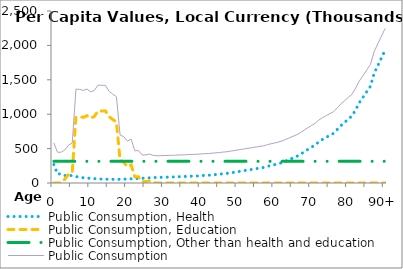
| Category | Public Consumption, Health | Public Consumption, Education | Public Consumption, Other than health and education | Public Consumption |
|---|---|---|---|---|
| 0 | 269180.341 | 0 | 315238.829 | 584419.17 |
|  | 130651.226 | 0 | 315238.829 | 445890.055 |
| 2 | 132973.435 | 0 | 315238.829 | 448212.264 |
| 3 | 108960.648 | 56925.528 | 315238.829 | 481125.005 |
| 4 | 108177.407 | 127485.189 | 315238.829 | 550901.425 |
| 5 | 108504.248 | 155849.815 | 315238.829 | 579592.893 |
| 6 | 94921.529 | 953799.516 | 315238.829 | 1363959.874 |
| 7 | 81411.27 | 964781.747 | 315238.829 | 1361431.846 |
| 8 | 76787.53 | 953878.912 | 315238.829 | 1345905.271 |
| 9 | 72190.279 | 978075.618 | 315238.829 | 1365504.725 |
| 10 | 67584.155 | 942850.805 | 315238.829 | 1325673.788 |
| 11 | 62978.394 | 966740.408 | 315238.829 | 1344957.632 |
| 12 | 58357.602 | 1048937.111 | 315238.829 | 1422533.542 |
| 13 | 57062.298 | 1047144.906 | 315238.829 | 1419446.032 |
| 14 | 55773.501 | 1048311.863 | 315238.829 | 1419324.193 |
| 15 | 54492.107 | 963937.778 | 315238.829 | 1333668.714 |
| 16 | 53199.974 | 923105.846 | 315238.829 | 1291544.649 |
| 17 | 51908.199 | 887334.637 | 315238.829 | 1254481.665 |
| 18 | 54012.556 | 327682.424 | 315238.829 | 696933.809 |
| 19 | 56101.066 | 302029.8 | 315238.829 | 673369.695 |
| 20 | 58212.193 | 235126.773 | 315238.829 | 608577.795 |
| 21 | 60311.878 | 261435.768 | 315238.829 | 636986.475 |
| 22 | 62374.358 | 90069.623 | 315238.829 | 467682.81 |
| 23 | 65693.699 | 89996.075 | 315238.829 | 470928.603 |
| 24 | 68980.292 | 21584.086 | 315238.829 | 405803.207 |
| 25 | 72290.96 | 21076.734 | 315238.829 | 408606.523 |
| 26 | 75583.635 | 29836.261 | 315238.829 | 420658.725 |
| 27 | 78910.839 | 7118.146 | 315238.829 | 401267.813 |
| 28 | 80547.707 | 0 | 315238.829 | 395786.536 |
| 29 | 82167.592 | 0 | 315238.829 | 397406.42 |
| 30 | 83822.464 | 0 | 315238.829 | 399061.293 |
| 31 | 85468.683 | 0 | 315238.829 | 400707.512 |
| 32 | 87049.79 | 0 | 315238.829 | 402288.619 |
| 33 | 89272.118 | 0 | 315238.829 | 404510.947 |
| 34 | 91496.674 | 0 | 315238.829 | 406735.502 |
| 35 | 93707.385 | 0 | 315238.829 | 408946.214 |
| 36 | 96036.455 | 0 | 315238.829 | 411275.284 |
| 37 | 98160.304 | 0 | 315238.829 | 413399.133 |
| 38 | 100277.812 | 0 | 315238.829 | 415516.641 |
| 39 | 102330.023 | 0 | 315238.829 | 417568.852 |
| 40 | 108229.289 | 0 | 315238.829 | 423468.118 |
| 41 | 110300.783 | 0 | 315238.829 | 425539.612 |
| 42 | 112412.881 | 0 | 315238.829 | 427651.709 |
| 43 | 117849.903 | 0 | 315238.829 | 433088.732 |
| 44 | 123143.302 | 0 | 315238.829 | 438382.13 |
| 45 | 128519.533 | 0 | 315238.829 | 443758.362 |
| 46 | 133805.157 | 0 | 315238.829 | 449043.986 |
| 47 | 139133.511 | 0 | 315238.829 | 454372.34 |
| 48 | 147737.911 | 0 | 315238.829 | 462976.74 |
| 49 | 156310.776 | 0 | 315238.829 | 471549.604 |
| 50 | 164940.639 | 0 | 315238.829 | 480179.468 |
| 51 | 173553.882 | 0 | 315238.829 | 488792.711 |
| 52 | 182377.233 | 0 | 315238.829 | 497616.062 |
| 53 | 191059.604 | 0 | 315238.829 | 506298.433 |
| 54 | 199643.541 | 0 | 315238.829 | 514882.37 |
| 55 | 208529.389 | 0 | 315238.829 | 523768.218 |
| 56 | 218008.06 | 0 | 315238.829 | 533246.888 |
| 57 | 225400.034 | 0 | 315238.829 | 540638.863 |
| 58 | 241236.092 | 0 | 315238.829 | 556474.921 |
| 59 | 254366.103 | 0 | 315238.829 | 569604.932 |
| 60 | 266776.604 | 0 | 315238.829 | 582015.433 |
| 61 | 280550.584 | 0 | 315238.829 | 595789.413 |
| 62 | 296459.444 | 0 | 315238.829 | 611698.273 |
| 63 | 318436.792 | 0 | 315238.829 | 633675.62 |
| 64 | 341931.554 | 0 | 315238.829 | 657170.383 |
| 65 | 364321.92 | 0 | 315238.829 | 679560.749 |
| 66 | 387008.498 | 0 | 315238.829 | 702247.327 |
| 67 | 416881.616 | 0 | 315238.829 | 732120.445 |
| 68 | 453275.775 | 0 | 315238.829 | 768514.603 |
| 69 | 487164.582 | 0 | 315238.829 | 802403.41 |
| 70 | 520592.401 | 0 | 315238.829 | 835831.229 |
| 71 | 553957.641 | 0 | 315238.829 | 869196.469 |
| 72 | 599997.834 | 0 | 315238.829 | 915236.663 |
| 73 | 634700.168 | 0 | 315238.829 | 949938.996 |
| 74 | 663865.893 | 0 | 315238.829 | 979104.722 |
| 75 | 692940.909 | 0 | 315238.829 | 1008179.738 |
| 76 | 722053.638 | 0 | 315238.829 | 1037292.467 |
| 77 | 778023.062 | 0 | 315238.829 | 1093261.891 |
| 78 | 835142.023 | 0 | 315238.829 | 1150380.852 |
| 79 | 881959.967 | 0 | 315238.829 | 1197198.795 |
| 80 | 929357.218 | 0 | 315238.829 | 1244596.047 |
| 81 | 975350.389 | 0 | 315238.829 | 1290589.218 |
| 82 | 1066375.38 | 0 | 315238.829 | 1381614.208 |
| 83 | 1168437.223 | 0 | 315238.829 | 1483676.052 |
| 84 | 1247864.902 | 0 | 315238.829 | 1563103.731 |
| 85 | 1327730.85 | 0 | 315238.829 | 1642969.678 |
| 86 | 1406909.236 | 0 | 315238.829 | 1722148.065 |
| 87 | 1592519.222 | 0 | 315238.829 | 1907758.051 |
| 88 | 1706041.901 | 0 | 315238.829 | 2021280.729 |
| 89 | 1819564.579 | 0 | 315238.829 | 2134803.408 |
| 90+ | 1933087.257 | 0 | 315238.829 | 2248326.086 |